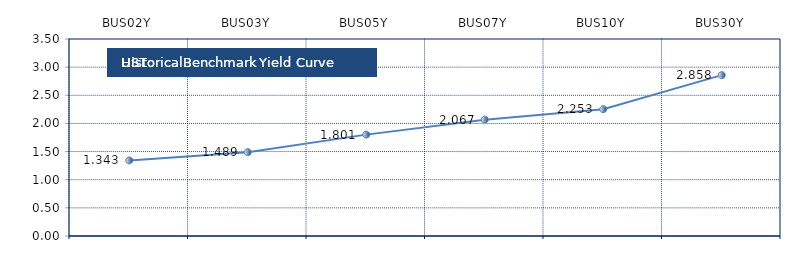
| Category | Series 0 |
|---|---|
| BUS02Y | 1.343 |
| BUS03Y | 1.489 |
| BUS05Y | 1.801 |
| BUS07Y | 2.067 |
| BUS10Y | 2.253 |
| BUS30Y | 2.858 |